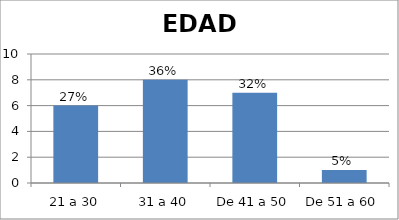
| Category | Series 0 |
|---|---|
| 21 a 30 | 6 |
| 31 a 40 | 8 |
| De 41 a 50 | 7 |
| De 51 a 60 | 1 |